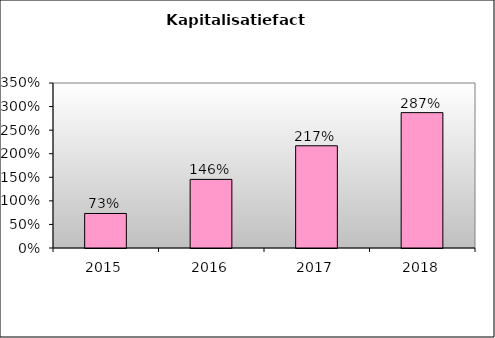
| Category | Series 0 |
|---|---|
| 2015.0 | 0.732 |
| 2016.0 | 1.455 |
| 2017.0 | 2.168 |
| 2018.0 | 2.872 |